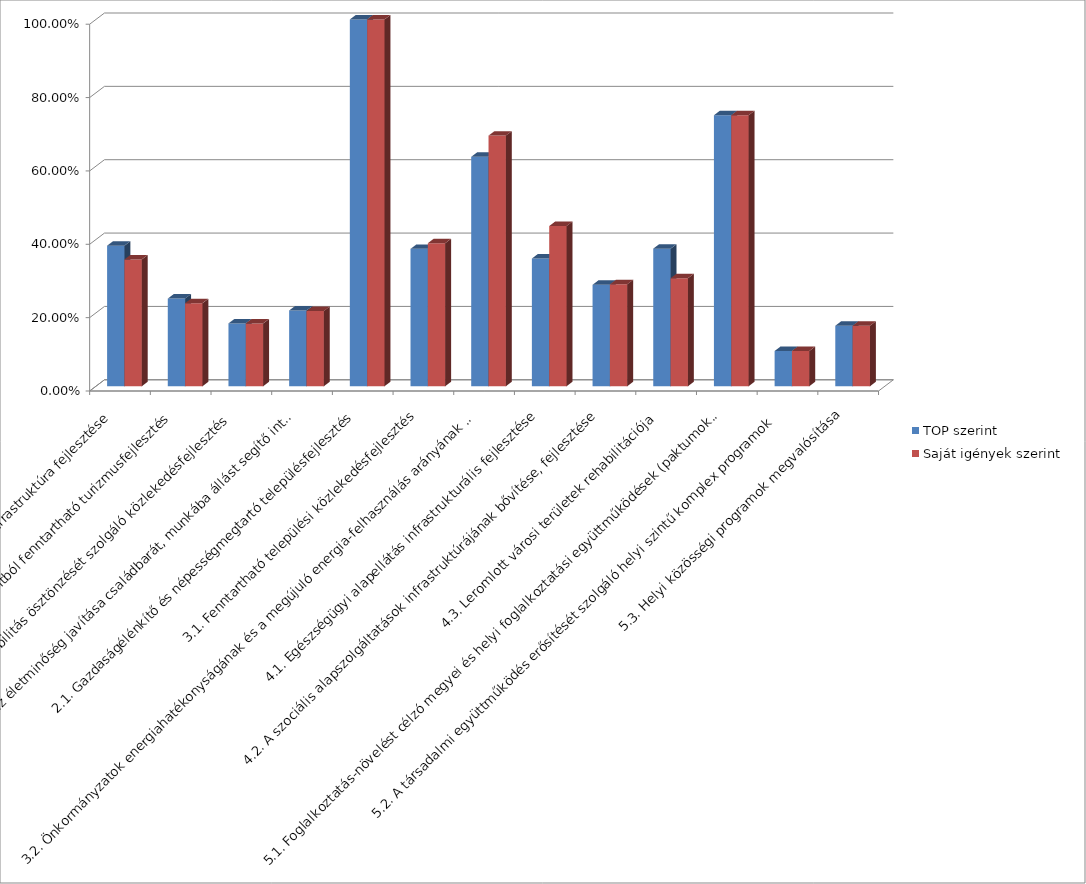
| Category | TOP szerint  | Saját igények szerint  |
|---|---|---|
| 1.1. Helyi gazdasági infrastruktúra fejlesztése | 0.383 | 0.346 |
| 1.2. Társadalmi és környezeti szempontból fenntartható turizmusfejlesztés | 0.239 | 0.227 |
| 1.3. A gazdaságfejlesztést és a munkaerő mobilitás ösztönzését szolgáló közlekedésfejlesztés | 0.171 | 0.171 |
| 1.4. A foglalkoztatás segítése és az életminőség javítása családbarát, munkába állást segítő intézmények, közszolgáltatások fejlesztésével | 0.207 | 0.205 |
| 2.1. Gazdaságélénkítő és népességmegtartó településfejlesztés | 1 | 1 |
| 3.1. Fenntartható települési közlekedésfejlesztés | 0.375 | 0.39 |
| 3.2. Önkormányzatok energiahatékonyságának és a megújuló energia-felhasználás arányának növelése | 0.625 | 0.683 |
| 4.1. Egészségügyi alapellátás infrastrukturális fejlesztése | 0.348 | 0.437 |
| 4.2. A szociális alapszolgáltatások infrastruktúrájának bővítése, fejlesztése | 0.277 | 0.278 |
| 4.3. Leromlott városi területek rehabilitációja | 0.375 | 0.294 |
| 5.1. Foglalkoztatás-növelést célzó megyei és helyi foglalkoztatási együttműködések (paktumok) | 0.739 | 0.739 |
| 5.2. A társadalmi együttműködés erősítését szolgáló helyi szintű komplex programok  | 0.096 | 0.096 |
| 5.3. Helyi közösségi programok megvalósítása | 0.165 | 0.165 |